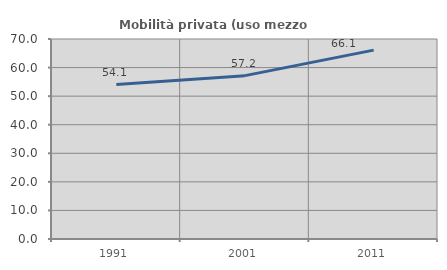
| Category | Mobilità privata (uso mezzo privato) |
|---|---|
| 1991.0 | 54.07 |
| 2001.0 | 57.174 |
| 2011.0 | 66.1 |